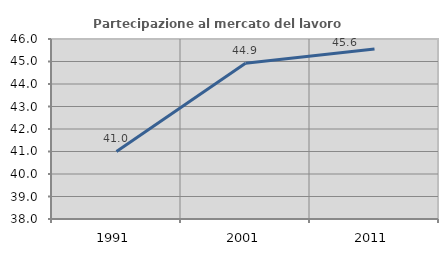
| Category | Partecipazione al mercato del lavoro  femminile |
|---|---|
| 1991.0 | 41.001 |
| 2001.0 | 44.921 |
| 2011.0 | 45.551 |